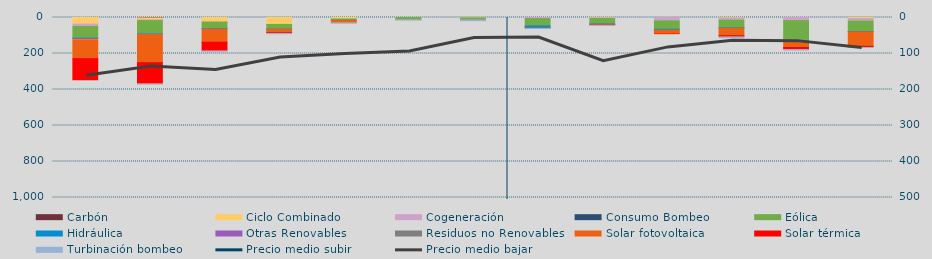
| Category | Carbón | Ciclo Combinado | Cogeneración | Consumo Bombeo | Eólica | Hidráulica | Otras Renovables | Residuos no Renovables | Solar fotovoltaica | Solar térmica | Turbinación bombeo |
|---|---|---|---|---|---|---|---|---|---|---|---|
| 0 | 0 | 36734.9 | 12855.2 | 0 | 65071.5 | 1518 | 6583 | 675 | 105142.4 | 122842 | 0 |
| 1 | 2096 | 11203.8 | 3780.2 | 0 | 74938.3 | 359.9 | 3182.9 | 0 | 155352.2 | 119223.3 | 200 |
| 2 | 0 | 23416.9 | 1799.3 | 0 | 36710.1 | 169.9 | 2791.7 | 130.2 | 72190.6 | 49997.5 | 140 |
| 3 | 0 | 38168.9 | 488.4 | 0 | 26054.9 | 21.9 | 466.4 | 0 | 19329.3 | 4158.9 | 1184.2 |
| 4 | 0 | 7357.7 | 1214.8 | 0 | 7240.9 | 133.6 | 501.7 | 0 | 12900.5 | 0 | 280 |
| 5 | 0 | 0 | 195.2 | 0 | 11271.7 | 31.8 | 43.5 | 0 | 327.2 | 72.2 | 190.9 |
| 6 | 0 | 1594 | 466.5 | 0 | 10201.8 | 124.4 | 68.4 | 0 | 144.3 | 50.3 | 5089.6 |
| 7 | 0 | 0 | 5902.2 | 0 | 40924.6 | 10096 | 2210.8 | 541.2 | 397.2 | 861 | 700 |
| 8 | 0 | 2180.9 | 2937.8 | 0 | 30839.8 | 1899.6 | 565.6 | 0 | 1849.2 | 2802 | 1100 |
| 9 | 0 | 0 | 18046.2 | 0 | 47159 | 4513.5 | 523.7 | 0 | 19900.6 | 2658.1 | 0 |
| 10 | 0 | 2280 | 11810.8 | 0 | 43127.1 | 1164.1 | 1123.7 | 0 | 41530.2 | 8077.8 | 3040.7 |
| 11 | 0 | 0 | 17047.5 | 0 | 112869.5 | 3513.3 | 2033.2 | 0 | 31386.8 | 12440.9 | 1549.6 |
| 12 | 0 | 5564.7 | 13323.5 | 0 | 59321.6 | 487.1 | 2690.6 | 340 | 78205.9 | 6474.7 | 234.9 |